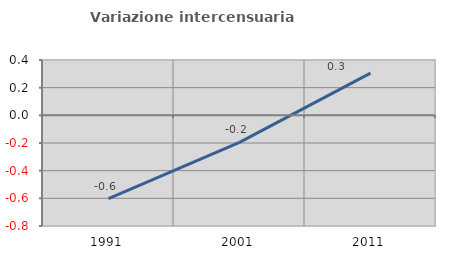
| Category | Variazione intercensuaria annua |
|---|---|
| 1991.0 | -0.603 |
| 2001.0 | -0.196 |
| 2011.0 | 0.305 |